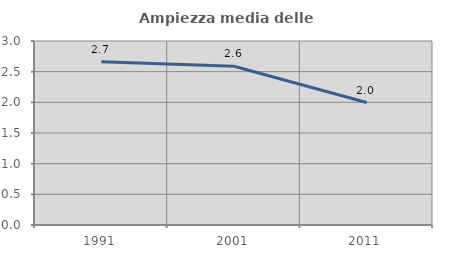
| Category | Ampiezza media delle famiglie |
|---|---|
| 1991.0 | 2.663 |
| 2001.0 | 2.589 |
| 2011.0 | 1.996 |